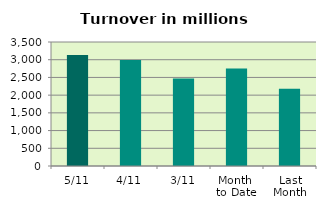
| Category | Series 0 |
|---|---|
| 5/11 | 3129.951 |
| 4/11 | 2990.072 |
| 3/11 | 2467.779 |
| Month 
to Date | 2754.658 |
| Last
Month | 2179.795 |